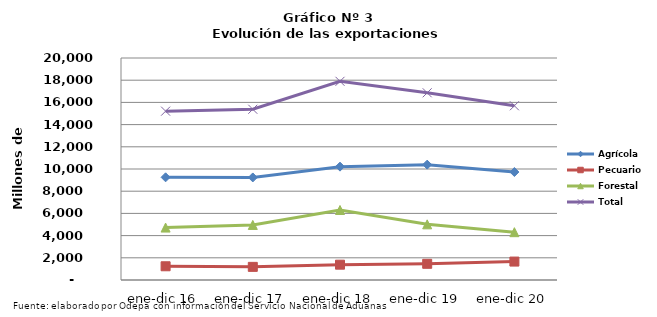
| Category | Agrícola | Pecuario | Forestal | Total |
|---|---|---|---|---|
| ene-dic 16 | 9250572 | 1236616 | 4722907 | 15210095 |
| ene-dic 17 | 9238481 | 1182554 | 4960800 | 15381835 |
| ene-dic 18 | 10212418 | 1380778 | 6307561 | 17900757 |
| ene-dic 19 | 10391418 | 1458634 | 5015438 | 16865490 |
| ene-dic 20 | 9728152 | 1659733 | 4308557 | 15696442 |